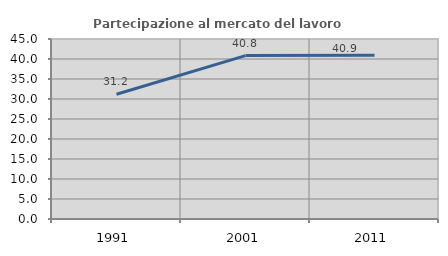
| Category | Partecipazione al mercato del lavoro  femminile |
|---|---|
| 1991.0 | 31.186 |
| 2001.0 | 40.845 |
| 2011.0 | 40.909 |